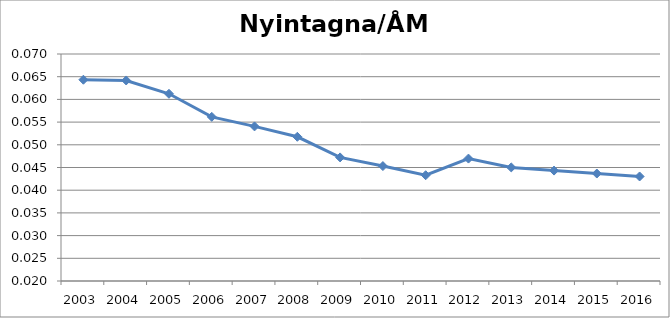
| Category | Nyintagna/ÅM ut |
|---|---|
| 2003.0 | 0.064 |
| 2004.0 | 0.064 |
| 2005.0 | 0.061 |
| 2006.0 | 0.056 |
| 2007.0 | 0.054 |
| 2008.0 | 0.052 |
| 2009.0 | 0.047 |
| 2010.0 | 0.045 |
| 2011.0 | 0.043 |
| 2012.0 | 0.047 |
| 2013.0 | 0.045 |
| 2014.0 | 0.044 |
| 2015.0 | 0.044 |
| 2016.0 | 0.043 |